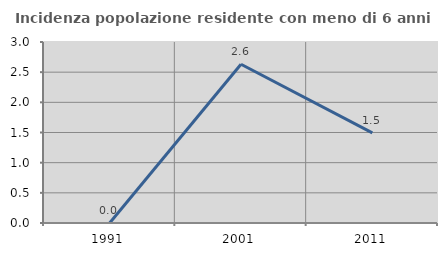
| Category | Incidenza popolazione residente con meno di 6 anni |
|---|---|
| 1991.0 | 0 |
| 2001.0 | 2.632 |
| 2011.0 | 1.493 |